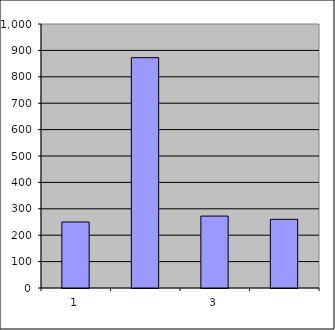
| Category | Series 0 |
|---|---|
| 0 | 250 |
| 1 | 872.401 |
| 2 | 272.49 |
| 3 | 260.166 |